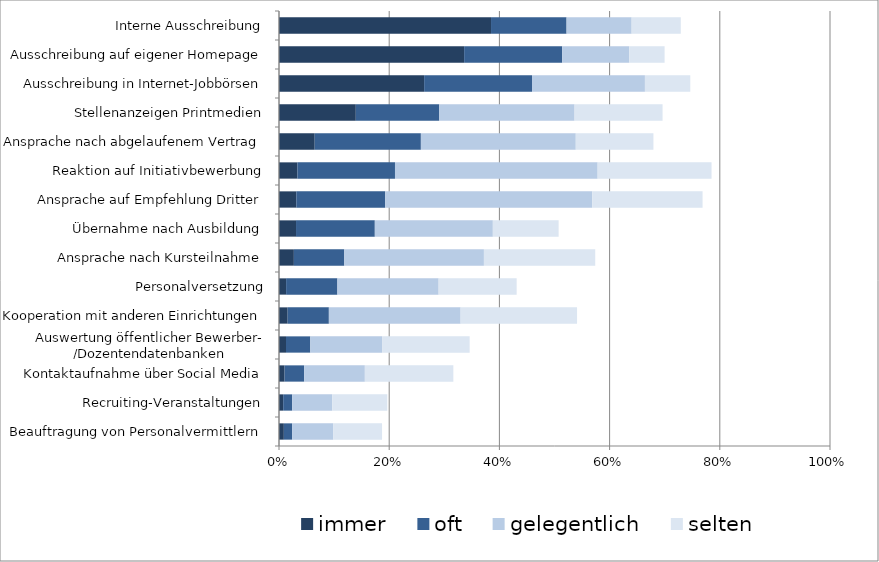
| Category | immer | oft | gelegentlich | selten  |
|---|---|---|---|---|
| Beauftragung von Personalvermittlern | 0.009 | 0.015 | 0.075 | 0.088 |
| Recruiting-Veranstaltungen | 0.008 | 0.016 | 0.073 | 0.1 |
| Kontaktaufnahme über Social Media | 0.01 | 0.036 | 0.11 | 0.161 |
| Auswertung öffentlicher Bewerber- /Dozentendatenbanken | 0.013 | 0.044 | 0.13 | 0.159 |
| Kooperation mit anderen Einrichtungen | 0.016 | 0.075 | 0.239 | 0.211 |
| Personalversetzung | 0.013 | 0.093 | 0.184 | 0.142 |
| Ansprache nach Kursteilnahme | 0.027 | 0.092 | 0.253 | 0.202 |
| Übernahme nach Ausbildung | 0.031 | 0.143 | 0.214 | 0.119 |
| Ansprache auf Empfehlung Dritter | 0.031 | 0.161 | 0.376 | 0.2 |
| Reaktion auf Initiativbewerbung | 0.034 | 0.177 | 0.368 | 0.207 |
| Ansprache nach abgelaufenem Vertrag | 0.065 | 0.193 | 0.281 | 0.141 |
| Stellenanzeigen Printmedien | 0.139 | 0.152 | 0.246 | 0.16 |
| Ausschreibung in Internet-Jobbörsen | 0.263 | 0.196 | 0.205 | 0.082 |
| Ausschreibung auf eigener Homepage | 0.336 | 0.178 | 0.122 | 0.064 |
| Interne Ausschreibung | 0.385 | 0.137 | 0.118 | 0.089 |